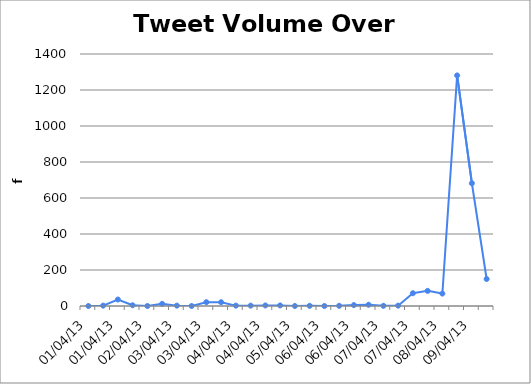
| Category | Series 0 |
|---|---|
| 2013-04-01 07:12:00 | 0 |
| 2013-04-01 14:24:00 | 2 |
| 2013-04-01 21:36:00 | 36 |
| 2013-04-02 04:48:00 | 4 |
| 2013-04-02 12:00:00 | 0 |
| 2013-04-02 19:12:00 | 12 |
| 2013-04-03 02:24:00 | 2 |
| 2013-04-03 09:36:00 | 0 |
| 2013-04-03 16:48:00 | 21 |
| 2013-04-04 | 21 |
| 2013-04-04 07:12:00 | 2 |
| 2013-04-04 14:24:00 | 2 |
| 2013-04-04 21:36:00 | 3 |
| 2013-04-05 04:48:00 | 3 |
| 2013-04-05 12:00:00 | 0 |
| 2013-04-05 19:12:00 | 1 |
| 2013-04-06 02:24:00 | 0 |
| 2013-04-06 09:36:00 | 1 |
| 2013-04-06 16:48:00 | 5 |
| 2013-04-07 | 7 |
| 2013-04-07 07:12:00 | 1 |
| 2013-04-07 14:24:00 | 2 |
| 2013-04-07 21:36:00 | 71 |
| 2013-04-08 04:48:00 | 84 |
| 2013-04-08 12:00:00 | 69 |
| 2013-04-08 19:12:00 | 1281 |
| 2013-04-09 02:24:00 | 682 |
| 2013-04-09 09:36:00 | 150 |